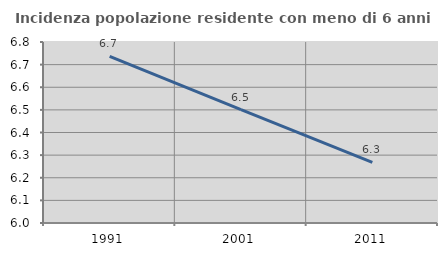
| Category | Incidenza popolazione residente con meno di 6 anni |
|---|---|
| 1991.0 | 6.737 |
| 2001.0 | 6.501 |
| 2011.0 | 6.268 |